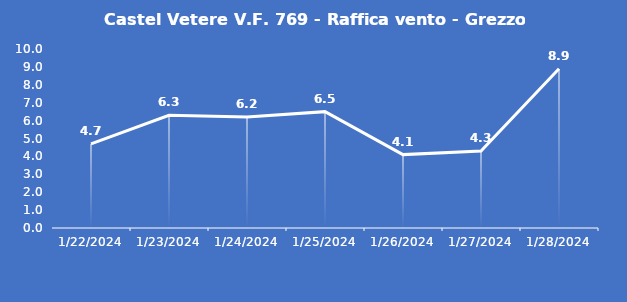
| Category | Castel Vetere V.F. 769 - Raffica vento - Grezzo (m/s) |
|---|---|
| 1/22/24 | 4.7 |
| 1/23/24 | 6.3 |
| 1/24/24 | 6.2 |
| 1/25/24 | 6.5 |
| 1/26/24 | 4.1 |
| 1/27/24 | 4.3 |
| 1/28/24 | 8.9 |